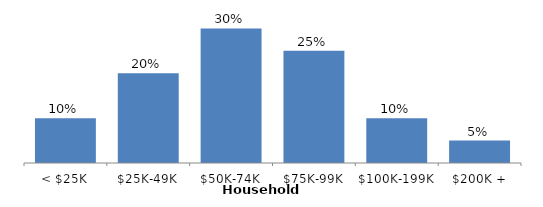
| Category | Series 0 |
|---|---|
| < $25K | 0.1 |
| $25K-49K | 0.2 |
| $50K-74K | 0.3 |
| $75K-99K | 0.25 |
| $100K-199K | 0.1 |
| $200K + | 0.05 |